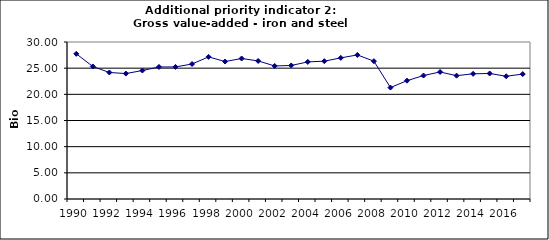
| Category | Gross value-added - iron and steel industry, Bio Euro (EC95) |
|---|---|
| 1990 | 27.742 |
| 1991 | 25.326 |
| 1992 | 24.177 |
| 1993 | 23.966 |
| 1994 | 24.553 |
| 1995 | 25.233 |
| 1996 | 25.233 |
| 1997 | 25.795 |
| 1998 | 27.156 |
| 1999 | 26.264 |
| 2000 | 26.851 |
| 2001 | 26.382 |
| 2002 | 25.42 |
| 2003 | 25.514 |
| 2004 | 26.194 |
| 2005 | 26.335 |
| 2006 | 26.968 |
| 2007 | 27.531 |
| 2008 | 26.335 |
| 2009 | 21.293 |
| 2010 | 22.606 |
| 2011 | 23.591 |
| 2012 | 24.271 |
| 2013 | 23.568 |
| 2014 | 23.919 |
| 2015 | 23.99 |
| 2016 | 23.45 |
| 2017 | 23.873 |